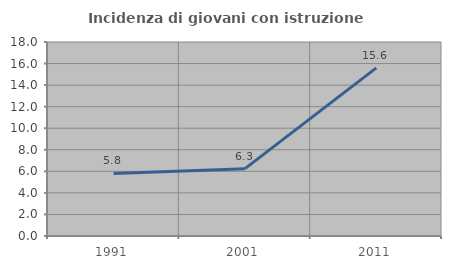
| Category | Incidenza di giovani con istruzione universitaria |
|---|---|
| 1991.0 | 5.806 |
| 2001.0 | 6.25 |
| 2011.0 | 15.596 |